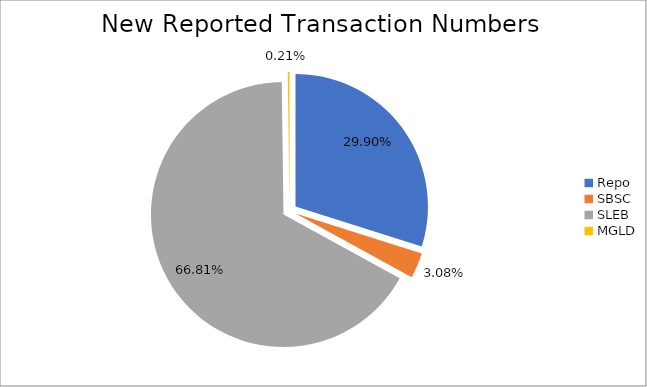
| Category | Series 0 |
|---|---|
| Repo | 443150 |
| SBSC | 45684 |
| SLEB | 990324 |
| MGLD | 3133 |